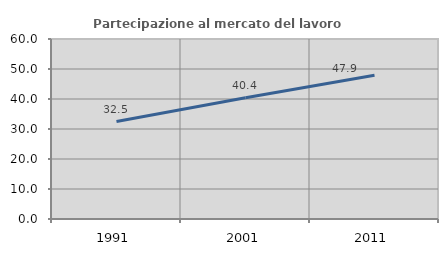
| Category | Partecipazione al mercato del lavoro  femminile |
|---|---|
| 1991.0 | 32.492 |
| 2001.0 | 40.427 |
| 2011.0 | 47.895 |